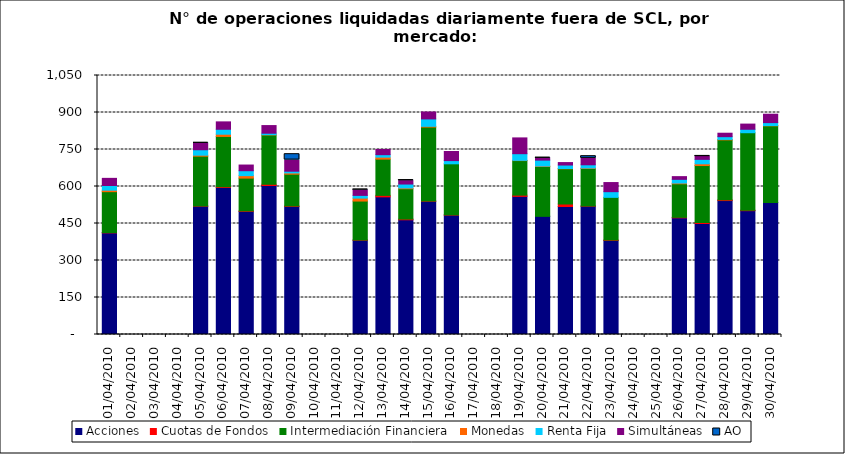
| Category | Acciones | Cuotas de Fondos | Intermediación Financiera | Monedas | Renta Fija | Simultáneas | AO |
|---|---|---|---|---|---|---|---|
| 01/04/2010 | 412 | 1 | 166 | 6 | 19 | 29 | 0 |
| 05/04/2010 | 520 | 1 | 202 | 4 | 22 | 26 | 2 |
| 06/04/2010 | 596 | 3 | 204 | 9 | 20 | 30 | 0 |
| 07/04/2010 | 499 | 2 | 133 | 10 | 20 | 23 | 0 |
| 08/04/2010 | 604 | 5 | 200 | 1 | 6 | 31 | 0 |
| 09/04/2010 | 519 | 2 | 129 | 5 | 7 | 45 | 24 |
| 12/04/2010 | 382 | 1 | 158 | 12 | 11 | 22 | 1 |
| 13/04/2010 | 558 | 6 | 147 | 8 | 10 | 21 | 0 |
| 14/04/2010 | 465 | 3 | 123 | 3 | 16 | 14 | 1 |
| 15/04/2010 | 540 | 1 | 300 | 3 | 30 | 28 | 0 |
| 16/04/2010 | 484 | 1 | 207 | 0 | 13 | 37 | 0 |
| 19/04/2010 | 560 | 5 | 140 | 1 | 27 | 64 | 0 |
| 20/04/2010 | 479 | 0 | 202 | 2 | 24 | 8 | 1 |
| 21/04/2010 | 519 | 10 | 143 | 1 | 14 | 10 | 0 |
| 22/04/2010 | 520 | 1 | 152 | 2 | 13 | 26 | 9 |
| 23/04/2010 | 381 | 2 | 173 | 0 | 23 | 37 | 0 |
| 26/04/2010 | 473 | 2 | 136 | 3 | 15 | 11 | 0 |
| 27/04/2010 | 450 | 4 | 231 | 7 | 18 | 12 | 1 |
| 28/04/2010 | 543 | 3 | 243 | 2 | 11 | 14 | 0 |
| 29/04/2010 | 502 | 2 | 314 | 0 | 14 | 21 | 0 |
| 30/04/2010 | 535 | 0 | 311 | 1 | 12 | 34 | 0 |